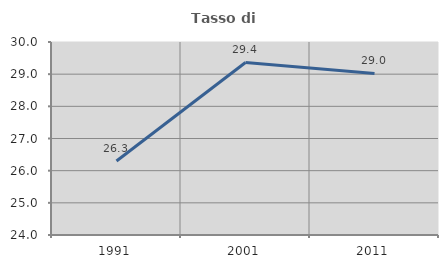
| Category | Tasso di occupazione   |
|---|---|
| 1991.0 | 26.3 |
| 2001.0 | 29.364 |
| 2011.0 | 29.022 |